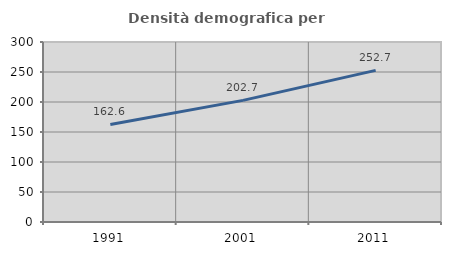
| Category | Densità demografica |
|---|---|
| 1991.0 | 162.628 |
| 2001.0 | 202.715 |
| 2011.0 | 252.724 |